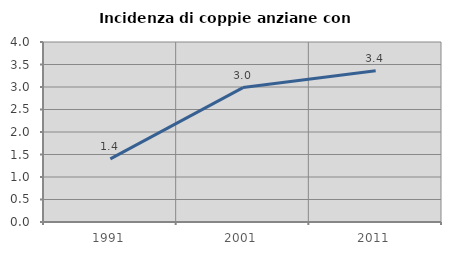
| Category | Incidenza di coppie anziane con figli |
|---|---|
| 1991.0 | 1.403 |
| 2001.0 | 2.987 |
| 2011.0 | 3.361 |